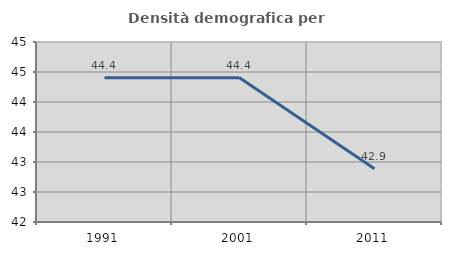
| Category | Densità demografica |
|---|---|
| 1991.0 | 44.403 |
| 2001.0 | 44.403 |
| 2011.0 | 42.887 |